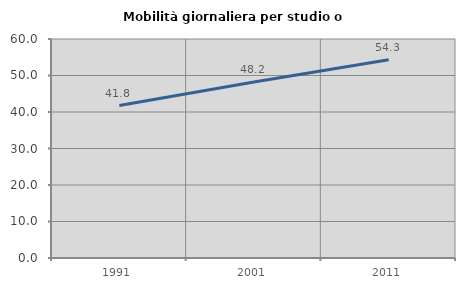
| Category | Mobilità giornaliera per studio o lavoro |
|---|---|
| 1991.0 | 41.756 |
| 2001.0 | 48.204 |
| 2011.0 | 54.294 |